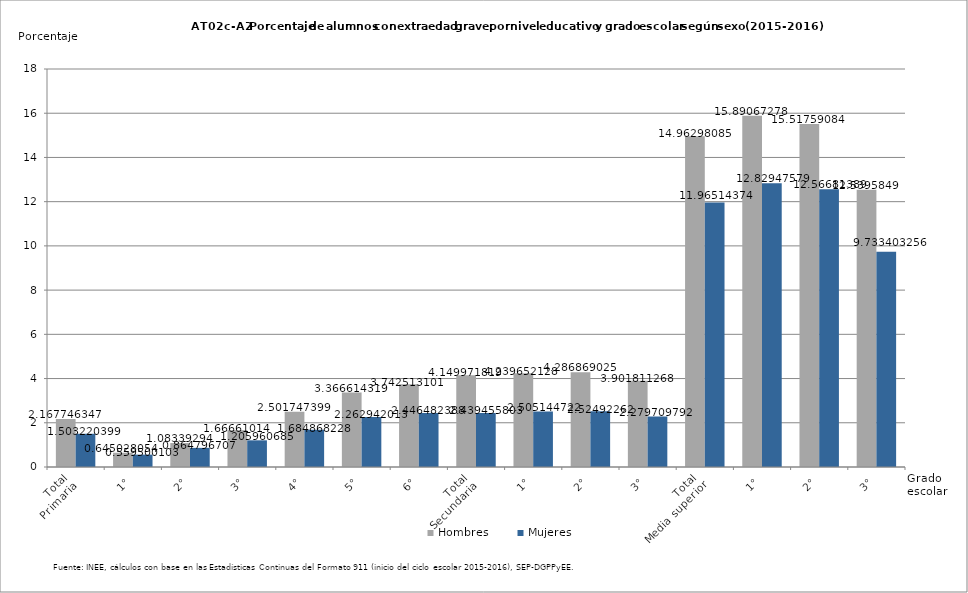
| Category | Hombres | Mujeres |
|---|---|---|
| 0 | 2.168 | 1.503 |
| 1 | 0.645 | 0.56 |
| 2 | 1.083 | 0.865 |
| 3 | 1.667 | 1.206 |
| 4 | 2.502 | 1.685 |
| 5 | 3.367 | 2.263 |
| 6 | 3.743 | 2.446 |
| 7 | 4.15 | 2.439 |
| 8 | 4.24 | 2.505 |
| 9 | 4.287 | 2.525 |
| 10 | 3.902 | 2.28 |
| 11 | 14.963 | 11.965 |
| 12 | 15.891 | 12.829 |
| 13 | 15.518 | 12.567 |
| 14 | 12.54 | 9.733 |